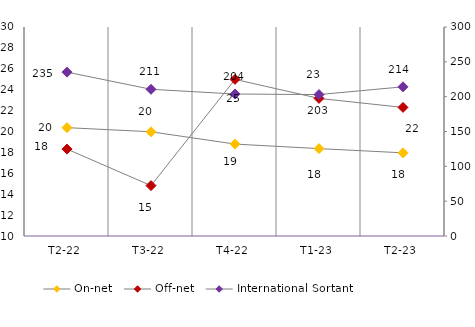
| Category | On-net | Off-net |
|---|---|---|
| T2-22 | 20.368 | 18.318 |
| T3-22 | 19.974 | 14.822 |
| T4-22 | 18.796 | 24.986 |
| T1-23 | 18.362 | 23.166 |
| T2-23 | 17.958 | 22.303 |